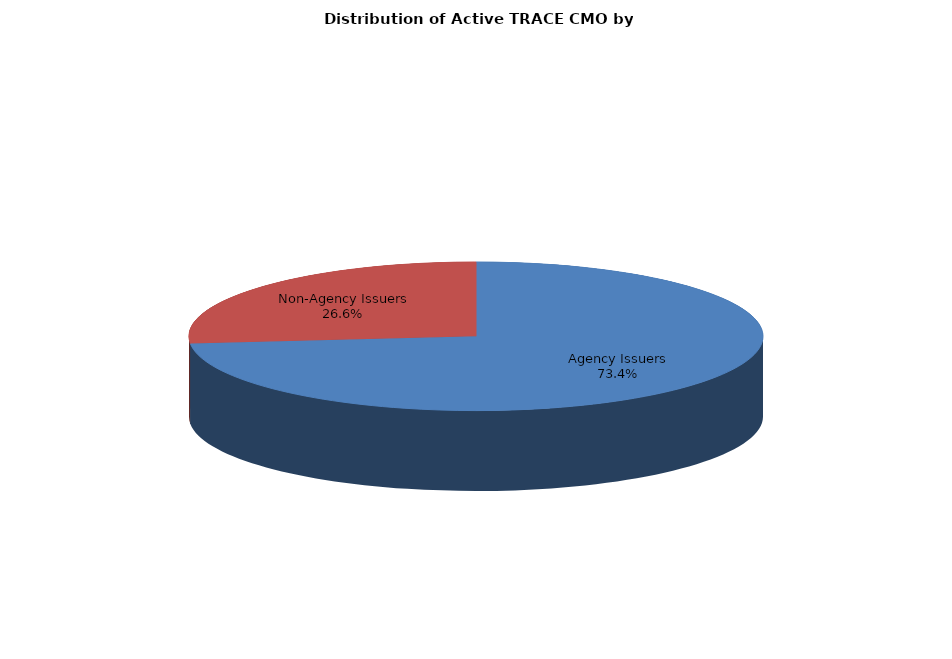
| Category | Series 0 |
|---|---|
| Agency Issuers | 255549 |
| Non-Agency Issuers | 92397 |